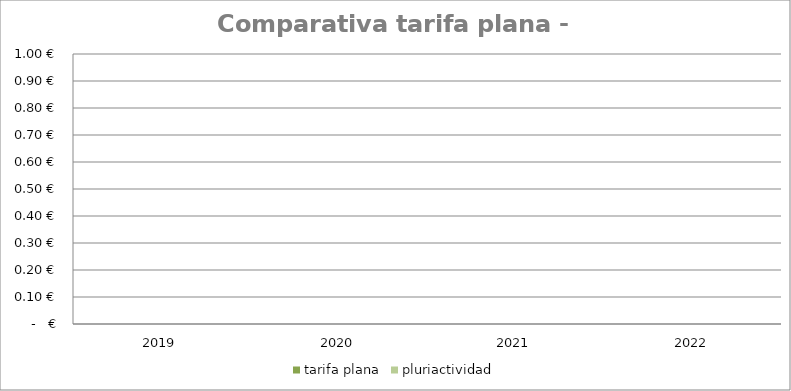
| Category | tarifa plana | pluriactividad |
|---|---|---|
| 2019.0 | 0 |  |
| 2020.0 | 0 |  |
| 2021.0 | 0 |  |
| 2022.0 | 0 |  |